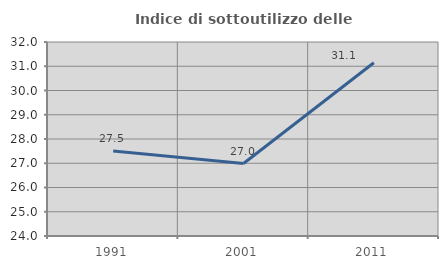
| Category | Indice di sottoutilizzo delle abitazioni  |
|---|---|
| 1991.0 | 27.507 |
| 2001.0 | 26.989 |
| 2011.0 | 31.147 |